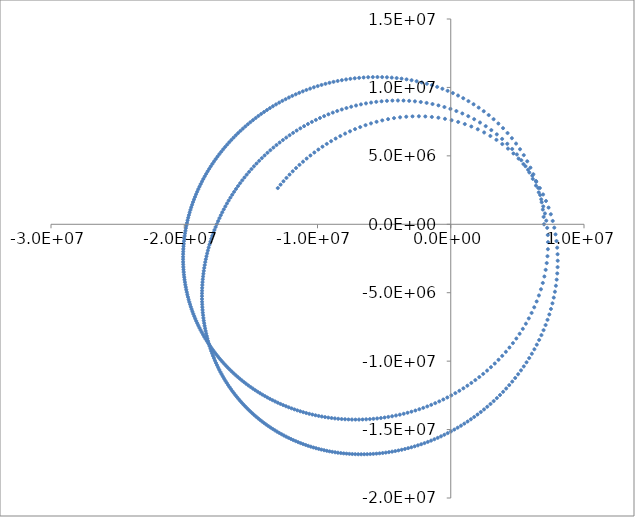
| Category | y |
|---|---|
| 7000000.0 | 0 |
| 6970744.563265306 | 540000 |
| 6912247.695336646 | 1077734.765 |
| 6824807.84654836 | 1610956.837 |
| 6709000.306904224 | 2137482.877 |
| 6565659.882708135 | 2655236.96 |
| 6395855.11030535 | 3162288.521 |
| 6200855.849663443 | 3656883.226 |
| 5982096.4569765115 | 4137465.668 |
| 5741136.837219459 | 4602693.514 |
| 5479623.544326599 | 5051443.393 |
| 5199252.78126137 | 5482809.333 |
| 4901736.72480994 | 5896094.911 |
| 4588774.131775136 | 6290800.493 |
| 4262025.734464467 | 6666606.966 |
| 3923094.546054238 | 7023357.27 |
| 3573510.8932948923 | 7361036.899 |
| 3214721.7810096205 | 7679754.301 |
| 2848084.0636164574 | 7979721.912 |
| 2474860.839920815 | 8261238.344 |
| 2096220.4821772815 | 8524672.048 |
| 1713237.7425587033 | 8770446.645 |
| 1326896.4353818125 | 8999027.985 |
| 938093.2602947245 | 9210912.906 |
| 547642.4017280855 | 9406619.618 |
| 156280.60757146648 | 9586679.579 |
| -235327.4881868231 | 9751630.726 |
| -626583.9799845004 | 9902011.914 |
| -1016952.3775834157 | 10038358.399 |
| -1405952.4626431507 | 10161198.243 |
| -1793155.3817200076 | 10271049.483 |
| -2178179.018357249 | 10368417.968 |
| -2560683.668356701 | 10453795.747 |
| -2940368.0283174207 | 10527659.907 |
| -3316965.497235217 | 10590471.797 |
| -3690240.783622947 | 10642676.559 |
| -4059986.805593554 | 10684702.901 |
| -4426021.868112298 | 10716963.078 |
| -4788187.099737138 | 10739853.027 |
| -5146344.130279017 | 10753752.624 |
| -5500372.990652505 | 10759026.034 |
| -5850170.216538583 | 10756022.14 |
| -6195647.138181509 | 10745075.008 |
| -6536728.339566849 | 10726504.405 |
| -6873350.2712853495 | 10700616.322 |
| -7205460.002509714 | 10667703.524 |
| -7533014.098649718 | 10628046.095 |
| -7855977.612371332 | 10581911.987 |
| -8174323.176744582 | 10529557.553 |
| -8488030.190307863 | 10471228.083 |
| -8797084.084794667 | 10407158.308 |
| -9101475.66715783 | 10337572.908 |
| -9401200.528345434 | 10262686.986 |
| -9696258.512032285 | 10182706.534 |
| -9986653.237194259 | 10097828.874 |
| -10272391.669032948 | 10008243.084 |
| -10553483.733319309 | 9914130.406 |
| -10829941.969731415 | 9815664.628 |
| -11101781.220217625 | 9713012.454 |
| -11369018.348826565 | 9606333.857 |
| -11631671.989813598 | 9495782.41 |
| -11889762.32116374 | 9381505.599 |
| -12143310.860967001 | 9263645.131 |
| -12392340.284347229 | 9142337.21 |
| -12636874.258882906 | 9017712.812 |
| -12876937.296670718 | 8889897.94 |
| -13112554.621372772 | 8759013.865 |
| -13343752.048758421 | 8625177.357 |
| -13570555.879403751 | 8488500.901 |
| -13792992.80234797 | 8349092.906 |
| -14011089.808627736 | 8207057.899 |
| -14224874.1137196 | 8062496.708 |
| -14434373.088018328 | 7915506.64 |
| -14639614.194566421 | 7766181.648 |
| -14840624.933328494 | 7614612.483 |
| -15037432.791374464 | 7460886.853 |
| -15230065.198398495 | 7305089.554 |
| -15418549.487057218 | 7147302.613 |
| -15602912.857661443 | 6987605.412 |
| -15783182.346801173 | 6826074.808 |
| -15959384.799524706 | 6662785.249 |
| -16131546.844729345 | 6497808.886 |
| -16299694.87345441 | 6331215.672 |
| -16463855.019796979 | 6163073.462 |
| -16624053.144197628 | 5993448.111 |
| -16780314.81886761 | 5822403.557 |
| -16932665.31515062 | 5650001.909 |
| -17081129.59263202 | 5476303.528 |
| -17225732.289826013 | 5301367.103 |
| -17366497.716287278 | 5125249.726 |
| -17503449.846008074 | 4948006.957 |
| -17636612.311974745 | 4769692.898 |
| -17766008.40176945 | 4590360.25 |
| -17891661.054113578 | 4410060.377 |
| -18013592.856258933 | 4228843.363 |
| -18131826.04214156 | 4046758.067 |
| -18246382.491220955 | 3863852.178 |
| -18357283.727934606 | 3680172.261 |
| -18464550.921704292 | 3495763.811 |
| -18568204.887436483 | 3310671.293 |
| -18668266.086464524 | 3124938.193 |
| -18764754.62788517 | 2938607.055 |
| -18857690.270246394 | 2751719.523 |
| -18947092.42354749 | 2564316.384 |
| -19032980.15151607 | 2376437.6 |
| -19115372.174129847 | 2188122.346 |
| -19194286.87035427 | 1999409.044 |
| -19269742.28106957 | 1810335.4 |
| -19341756.11216354 | 1620938.429 |
| -19410345.737768445 | 1431254.493 |
| -19475528.203622673 | 1241319.323 |
| -19537320.230539534 | 1051168.056 |
| -19595738.217967436 | 860835.256 |
| -19650798.24762715 | 670354.941 |
| -19702516.087213397 | 479760.613 |
| -19750907.19414924 | 289085.278 |
| -19795986.719383042 | 98361.473 |
| -19837769.51121877 | -92378.713 |
| -19876270.119171508 | -283103.614 |
| -19911502.797840904 | -473781.97 |
| -19943481.51079622 | -664382.899 |
| -19972219.93446726 | -854875.884 |
| -19997731.462036397 | -1045230.747 |
| -20020029.207327362 | -1235417.634 |
| -20039126.00868722 | -1425406.993 |
| -20055034.432858445 | -1615169.559 |
| -20067766.778838515 | -1804676.334 |
| -20077335.081725005 | -1993898.57 |
| -20083751.1165445 | -2182807.751 |
| -20087026.402064145 | -2371375.578 |
| -20087172.204585016 | -2559573.954 |
| -20084199.54171683 | -2747374.966 |
| -20078119.18613388 | -2934750.866 |
| -20068941.66931244 | -3121674.066 |
| -20056677.28525007 | -3308117.111 |
| -20041336.09416772 | -3494052.672 |
| -20022927.92619562 | -3679453.529 |
| -20001462.38504438 | -3864292.557 |
| -19976948.851662844 | -4048542.711 |
| -19949396.487884592 | -4232177.014 |
| -19918814.24006519 | -4415168.541 |
| -19885210.842712514 | -4597490.405 |
| -19848594.822112724 | -4779115.746 |
| -19808974.49995476 | -4960017.715 |
| -19766357.99695637 | -5140169.463 |
| -19720753.23649499 | -5319544.126 |
| -19672167.948247008 | -5498114.811 |
| -19620609.671839263 | -5675854.585 |
| -19566085.760516744 | -5852736.459 |
| -19508603.38483086 | -6028733.378 |
| -19448169.536352854 | -6203818.204 |
| -19384791.031417213 | -6377963.708 |
| -19318474.514900237 | -6551142.55 |
| -19249226.464039236 | -6723327.271 |
| -19177053.19229814 | -6894490.277 |
| -19101960.853285633 | -7064603.828 |
| -19023955.44473229 | -7233640.018 |
| -18943042.8125336 | -7401570.77 |
| -18859228.65486607 | -7568367.816 |
| -18772518.52638414 | -7734002.684 |
| -18682917.84250598 | -7898446.686 |
| -18590431.883796766 | -8061670.9 |
| -18495065.800458577 | -8223646.159 |
| -18396824.616936482 | -8384343.034 |
| -18295713.23665107 | -8543731.818 |
| -18191736.446868226 | -8701782.513 |
| -18084898.92371761 | -8858464.813 |
| -17975205.23737205 | -9013748.088 |
| -17862659.857400715 | -9167601.369 |
| -17747267.158309855 | -9319993.328 |
| -17629031.42528557 | -9470892.266 |
| -17507956.860154238 | -9620266.09 |
| -17384047.587576948 | -9768082.3 |
| -17257307.66149555 | -9914307.968 |
| -17127741.071848948 | -10058909.72 |
| -16995351.751579482 | -10201853.718 |
| -16860143.583950654 | -10343105.637 |
| -16722120.410198685 | -10482630.649 |
| -16581286.037542066 | -10620393.398 |
| -16437644.247574758 | -10756357.984 |
| -16291198.805070523 | -10890487.933 |
| -16141953.467227701 | -11022746.184 |
| -15989911.993385773 | -11153095.056 |
| -15835078.15524727 | -11281496.231 |
| -15677455.74764085 | -11407910.725 |
| -15517048.599864013 | -11532298.866 |
| -15353860.58764652 | -11654620.264 |
| -15187895.645778656 | -11774833.784 |
| -15019157.78145158 | -11892897.519 |
| -14847651.088360447 | -12008768.762 |
| -14673379.761624768 | -12122403.971 |
| -14496348.113584382 | -12233758.742 |
| -14316560.590533884 | -12342787.775 |
| -14134021.790462945 | -12449444.84 |
| -13948736.48187513 | -12553682.742 |
| -13760709.62376332 | -12655453.284 |
| -13569946.386825765 | -12754707.233 |
| -13376452.176013412 | -12851394.276 |
| -13180232.65450603 | -12945462.983 |
| -12981293.769222414 | -13036860.764 |
| -12779641.777978193 | -13125533.826 |
| -12575283.278413784 | -13211427.126 |
| -12368225.238824831 | -13294484.325 |
| -12158475.031038146 | -13374647.738 |
| -11946040.46548774 | -13451858.286 |
| -11730929.828658152 | -13526055.439 |
| -11513151.923076106 | -13597177.165 |
| -11292716.110046392 | -13665159.869 |
| -11069632.355344348 | -13729938.335 |
| -10843911.278095039 | -13791445.665 |
| -10615564.20308876 | -13849613.212 |
| -10384603.216803707 | -13904370.516 |
| -10151041.22742986 | -13955645.23 |
| -9914892.029213559 | -14003363.051 |
| -9676170.371469913 | -14047447.642 |
| -9434892.032640591 | -14087820.553 |
| -9191073.899807742 | -14124401.141 |
| -8944734.054111132 | -14157106.482 |
| -8695891.862555463 | -14185851.282 |
| -8444568.076738402 | -14210547.789 |
| -8190784.939077729 | -14231105.69 |
| -7934566.297168387 | -14247432.016 |
| -7675937.726957727 | -14259431.037 |
| -7414926.665490265 | -14267004.153 |
| -7151562.554042402 | -14270049.784 |
| -6885876.992543433 | -14268463.251 |
| -6617903.906262355 | -14262136.659 |
| -6347679.725831252 | -14250958.771 |
| -6075243.581776142 | -14234814.879 |
| -5800637.51483591 | -14213586.672 |
| -5523906.703470236 | -14187152.1 |
| -5245099.710089214 | -14155385.231 |
| -4964268.747681592 | -14118156.108 |
| -4681469.968676332 | -14075330.605 |
| -4396763.778044611 | -14026770.268 |
| -4110215.1728374 | -13972332.17 |
| -3821894.1105587077 | -13911868.753 |
| -3531875.9089972433 | -13845227.672 |
| -3240241.6803807984 | -13772251.639 |
| -2947078.8029787666 | -13692778.271 |
| -2652481.4335595113 | -13606639.937 |
| -2356551.0644109463 | -13513663.611 |
| -2059397.1289544194 | -13413670.732 |
| -1761137.6603227821 | -13306477.077 |
| -1461900.0076314248 | -13191892.641 |
| -1161821.6150428285 | -13069721.536 |
| -861050.8691059137 | -12939761.916 |
| -559748.0202339974 | -12801805.922 |
| -258086.18455946702 | -12655639.662 |
| 43747.5672444083 | -12501043.24 |
| 345551.02727236337 | -12337790.821 |
| 647105.5666780265 | -12165650.77 |
| 948174.7436492369 | -11984385.855 |
| 1248502.7957611384 | -11793753.546 |
| 1547813.0095854984 | -11593506.414 |
| 1845805.9608835033 | -11383392.656 |
| 2142157.619509968 | -11163156.773 |
| 2436517.314420419 | -10932540.42 |
| 2728505.5560372816 | -10691283.465 |
| 3017711.7158685504 | -10439125.296 |
| 3303691.5668911207 | -10175806.405 |
| 3585964.6930645728 | -9901070.312 |
| 3864011.7827311317 | -9614665.87 |
| 4137271.828937182 | -9316350.02 |
| 4405139.270285731 | -9005891.048 |
| 4666961.119247944 | -8683072.434 |
| 4922034.141406237 | -8347697.351 |
| 5169602.169354588 | -7999593.909 |
| 5408853.659380868 | -7638621.212 |
| 5638919.627917382 | -7264676.317 |
| 5858872.138153672 | -6877702.153 |
| 6067723.5448571155 | -6477696.456 |
| 6264426.746444407 | -6064721.747 |
| 6447876.735937304 | -5638916.327 |
| 6616913.78370213 | -5200506.236 |
| 6770328.620407274 | -4749818.002 |
| 6906870.012245613 | -4287291.969 |
| 7025255.1240203995 | -3813495.813 |
| 7124183.039195739 | -3329137.772 |
| 7202351.738177818 | -2835078.929 |
| 7258478.715529188 | -2332343.75 |
| 7291325.234053636 | -1822127.936 |
| 7299723.964063906 | -1305802.533 |
| 7282609.443376113 | -784913.222 |
| 7239050.433411914 | -261173.747 |
| 7168282.869722775 | 263547.37 |
| 7069741.756880705 | 787247.371 |
| 6943090.095306407 | 1307817.137 |
| 6788242.812161468 | 1823075.908 |
| 6605383.7521621445 | 2330811.731 |
| 6394974.09627546 | 2828825.901 |
| 6157751.1103899805 | 3314979.156 |
| 5894716.834321929 | 3787237.097 |
| 5607117.118497774 | 4243712.236 |
| 5296412.193052741 | 4682700.339 |
| 4964240.602858864 | 5102709.186 |
| 4612378.775697256 | 5502478.573 |
| 4242698.663114841 | 5880991.091 |
| 3857125.805078046 | 6237473.975 |
| 3457599.8627980184 | 6571392.908 |
| 3046039.209194893 | 6882439.091 |
| 2624310.6433345326 | 7170511.165 |
| 2194204.777243405 | 7435693.599 |
| 1757417.1866387066 | 7678233.09 |
| 1315535.0549538902 | 7898514.306 |
| 870028.7850108265 | 8097036.08 |
| 422247.9005108932 | 8274388.858 |
| -26579.50483839208 | 8431233.967 |
| -475344.5093918828 | 8568285.038 |
| -923052.9853919253 | 8686291.737 |
| -1368819.710539328 | 8786025.797 |
| -1811861.4874228316 | 8868269.266 |
| -2251489.694752815 | 8933804.805 |
| -2687102.605221528 | 8983407.836 |
| -3118177.7250295593 | 9017840.316 |
| -3544264.341681479 | 9037845.934 |
| -3964976.409973955 | 9044146.495 |
| -4379985.860577789 | 9037439.335 |
| -4789016.3800865775 | 9018395.554 |
| -5191837.68445544 | 8987658.941 |
| -5588260.287929195 | 8945845.453 |
| -5978130.755490804 | 8893543.12 |
| -6361327.417329201 | 8831312.303 |
| -6737756.517789138 | 8759686.206 |
| -7107348.767861429 | 8679171.592 |
| -7470056.268802457 | 8590249.635 |
| -7825849.77438552 | 8493376.874 |
| -8174716.260155491 | 8388986.236 |
| -8516656.769556403 | 8277488.082 |
| -8851684.508685121 | 8159271.285 |
| -9179823.163514296 | 8034704.295 |
| -9501105.41559625 | 7904136.19 |
| -9815571.634416597 | 7767897.708 |
| -10123268.726652125 | 7626302.24 |
| -10424249.124563266 | 7479646.791 |
| -10718569.897594659 | 7328212.903 |
| -11006291.972956957 | 7172267.531 |
| -11287479.452515787 | 7012063.879 |
| -11562199.014722282 | 6847842.195 |
| -11830519.391589725 | 6679830.522 |
| -12092510.911860753 | 6508245.405 |
| -12348245.10252889 | 6333292.565 |
| -12597794.341786616 | 6155167.525 |
| -12841231.557279903 | 5974056.205 |
| -13078629.964265823 | 5790135.484 |
| -13310062.83890459 | 5603573.718 |
| -13535603.322478948 | 5414531.239 |
| -13755324.252830075 | 5223160.814 |
| -13969298.019737206 | 5029608.081 |
| -14177596.441354888 | 4834011.955 |
| -14380290.659162652 | 4636505.012 |
| -14577451.049182596 | 4437213.848 |
| -14769147.147485327 | 4236259.415 |
| -14955447.588238332 | 4033757.336 |
| -15136420.05275672 | 3829818.204 |
| -15312131.228197744 | 3624547.861 |
| -15482646.774700541 | 3418047.655 |
| -15648031.299913507 | 3210414.693 |
| -15808348.339976206 | 3001742.065 |
| -15963660.346132366 | 2792119.064 |
| -16114028.676247371 | 2581631.391 |
| -16259513.590589091 | 2370361.345 |
| -16400174.251306295 | 2158388.005 |
| -16536068.72510556 | 1945787.398 |
| -16667253.988686346 | 1732632.662 |
| -16793785.936546 | 1518994.194 |
| -16915719.390812308 | 1304939.792 |
| -17033108.112801883 | 1090534.794 |
| -17146004.81603867 | 875842.197 |
| -17254461.18049848 | 660922.781 |
| -17358527.867873773 | 445835.221 |
| -17458254.537677635 | 230636.193 |
| -17553689.864028044 | 15380.472 |
| -17644881.552972957 | -199878.967 |
| -17731876.360234044 | -415090.864 |
| -17814720.109262187 | -630205.588 |
| -17893457.709511407 | -845175.054 |
| -17968133.174849868 | -1059952.65 |
| -18038789.64203724 | -1274493.163 |
| -18105469.389207084 | -1488752.71 |
| -18168213.854301322 | -1702688.671 |
| -18227063.653411098 | -1916259.631 |
| -18282058.598985016 | -2129425.321 |
| -18333237.717871387 | -2342146.557 |
| -18380639.26916629 | -2554385.194 |
| -18424300.761843767 | -2766104.069 |
| -18464258.972148415 | -2977266.958 |
| -18500549.960734222 | -3187838.526 |
| -18533209.089536555 | -3397784.286 |
| -18562271.038366973 | -3607070.558 |
| -18587769.82122293 | -3815664.425 |
| -18609738.8023066 | -4023533.702 |
| -18628210.711748876 | -4230646.891 |
| -18643217.66103626 | -4436973.154 |
| -18654791.158139803 | -4642482.276 |
| -18662962.12234647 | -4847144.634 |
| -18667760.898794476 | -5050931.168 |
| -18669217.272715036 | -5253813.349 |
| -18667360.483383775 | -5455763.154 |
| -18662219.237785902 | -5656753.036 |
| -18653821.723999705 | -5856755.902 |
| -18642195.624303576 | -6055745.086 |
| -18627368.128012195 | -6253694.327 |
| -18609365.944047913 | -6450577.742 |
| -18588215.313253682 | -6646369.808 |
| -18563942.0204542 | -6841045.341 |
| -18536571.406272165 | -7034579.472 |
| -18506128.37870669 | -7226947.63 |
| -18472637.424481213 | -7418125.523 |
| -18436122.620168235 | -7608089.117 |
| -18396607.643098425 | -7796814.621 |
| -18354115.782061685 | -7984278.468 |
| -18308669.947807867 | -8170457.298 |
| -18260292.683354862 | -8355327.943 |
| -18209006.174111858 | -8538867.411 |
| -18154832.257825576 | -8721052.868 |
| -18097792.434357353 | -8901861.626 |
| -18037907.875298936 | -9081271.129 |
| -17975199.4334349 | -9259258.934 |
| -17909687.652059592 | -9435802.703 |
| -17841392.77415656 | -9610880.185 |
| -17770334.751448415 | -9784469.203 |
| -17696533.253325127 | -9956547.645 |
| -17620007.675658736 | -10127093.446 |
| -17540777.149512578 | -10296084.579 |
| -17458860.54975304 | -10463499.04 |
| -17374276.503572036 | -10629314.839 |
| -17287043.398928344 | -10793509.985 |
| -17197179.392916076 | -10956062.476 |
| -17104702.420068588 | -11116950.284 |
| -17009630.200606223 | -11276151.35 |
| -16911980.248636406 | -11433643.567 |
| -16811769.880314667 | -11589404.769 |
| -16709016.221975341 | -11743412.722 |
| -16603736.218240803 | -11895645.111 |
| -16495946.64011823 | -12046079.531 |
| -16385664.093093101 | -12194693.474 |
| -16272905.025228782 | -12341464.317 |
| -16157685.73528177 | -12486369.313 |
| -16040022.380842391 | -12629385.58 |
| -15919930.986511003 | -12770490.089 |
| -15797427.452119982 | -12909659.651 |
| -15672527.561012117 | -13046870.911 |
| -15545246.988386307 | -13182100.33 |
| -15415601.309721818 | -13315324.18 |
| -15283606.00929273 | -13446518.53 |
| -15149276.488784572 | -13575659.232 |
| -15012628.076025642 | -13702721.915 |
| -14873676.033845875 | -13827681.968 |
| -14732435.569076713 | -13950514.533 |
| -14588921.841705924 | -14071194.488 |
| -14443149.97420189 | -14189696.439 |
| -14295135.061022526 | -14305994.706 |
| -14144892.17832465 | -14420063.311 |
| -13992436.393890323 | -14531875.965 |
| -13837782.777287481 | -14641406.056 |
| -13680946.410282945 | -14748626.634 |
| -13521942.397526853 | -14853510.4 |
| -13360785.877528412 | -14956029.691 |
| -13197492.033943972 | -15056156.468 |
| -13032076.10719941 | -15153862.299 |
| -12864553.406470068 | -15249118.346 |
| -12694939.322042648 | -15341895.353 |
| -12523249.338084856 | -15432163.625 |
| -12349499.045849985 | -15519893.017 |
| -12173704.157345153 | -15605052.92 |
| -11995880.519493574 | -15687612.239 |
| -11816044.128822945 | -15767539.38 |
| -11634211.146713968 | -15844802.234 |
| -11450397.915245008 | -15919368.158 |
| -11264620.973671041 | -15991203.956 |
| -11076897.075577393 | -16060275.863 |
| -10887243.206751226 | -16126549.527 |
| -10695676.603816416 | -16189989.984 |
| -10502214.77368032 | -16250561.646 |
| -10306875.513844 | -16308228.274 |
| -10109676.93363079 | -16362952.962 |
| -9910637.476391612 | -16414698.109 |
| -9709775.942749286 | -16463425.405 |
| -9507111.514948176 | -16509095.801 |
| -9302663.782379879 | -16551669.488 |
| -9096452.76836048 | -16591105.876 |
| -8888498.958239947 | -16627363.561 |
| -8678823.328929733 | -16660400.307 |
| -8467447.379940646 | -16690173.015 |
| -8254393.166029311 | -16716637.698 |
| -8039683.331558547 | -16739749.449 |
| -7823341.146684312 | -16759462.419 |
| -7605390.545489923 | -16775729.776 |
| -7385856.166196868 | -16788503.687 |
| -7164763.393590877 | -16797735.274 |
| -6942138.403811967 | -16803374.588 |
| -6718008.211668093 | -16805370.576 |
| -6492400.720643766 | -16803671.041 |
| -6265344.775787774 | -16798222.609 |
| -6036870.21967785 | -16788970.691 |
| -5807007.951675091 | -16775859.447 |
| -5575789.990697007 | -16758831.742 |
| -5343249.541755571 | -16737829.112 |
| -5109421.066525571 | -16712791.715 |
| -4874340.358229033 | -16683658.294 |
| -4638044.621143742 | -16650366.131 |
| -4400572.555067967 | -16612851.001 |
| -4161964.4450996066 | -16571047.128 |
| -3922262.2571163587 | -16524887.134 |
| -3681509.7393742055 | -16474301.994 |
| -3439752.5306749074 | -16419220.987 |
| -3197038.2755893692 | -16359571.64 |
| -2953416.7472630218 | -16295279.684 |
| -2708939.978371977 | -16226268.995 |
| -2463662.4008449377 | -16152461.545 |
| -2217640.9950160035 | -16073777.348 |
| -1970935.448927879 | -15990134.406 |
| -1723608.3285639544 | -15901448.651 |
| -1475725.2598515875 | -15807633.899 |
| -1227355.1233480778 | -15708601.787 |
| -978570.2625956428 | -15604261.726 |
| -729446.7072125807 | -15494520.848 |
| -480064.41187510896 | -15379283.952 |
| -230507.51243849163 | -15258453.461 |
| 19135.399452647893 | -15131929.372 |
| 268770.98180616094 | -14999609.217 |
| 518300.8262011751 | -14861388.023 |
| 767621.1184842591 | -14717158.281 |
| 1016622.2744109596 | -14566809.922 |
| 1265188.5482604892 | -14410230.295 |
| 1513197.6123036193 | -14247304.167 |
| 1760520.1048492538 | -14077913.719 |
| 2007019.144434781 | -13901938.569 |
| 2252549.8075606665 | -13719255.806 |
| 2496958.567203088 | -13529740.038 |
| 2740082.6891727927 | -13333263.477 |
| 2981749.5832279227 | -13129696.034 |
| 3221776.105698861 | -12918905.455 |
| 3459967.810251412 | -12700757.494 |
| 3696118.143310361 | -12475116.121 |
| 3930007.5806007925 | -12241843.786 |
| 4161402.7012550794 | -12000801.737 |
| 4390055.195999063 | -11751850.405 |
| 4615700.80609664 | -11494849.867 |
| 4838058.19002934 | -11229660.396 |
| 5056827.715355855 | -10956143.114 |
| 5271690.1738851005 | -10674160.766 |
| 5482305.419265641 | -10383578.626 |
| 5688310.927419147 | -10084265.567 |
| 5889320.282016901 | -9776095.302 |
| 6084921.589526948 | -9458947.84 |
| 6274675.83137834 | -9132711.176 |
| 6458115.164656344 | -8797283.241 |
| 6634741.187644867 | -8452574.175 |
| 6804023.192685527 | -8098508.925 |
| 6965396.436472124 | -7735030.249 |
| 7118260.467316581 | -7362102.143 |
| 7261977.560398349 | -6979713.765 |
| 7395871.325839038 | -6587883.878 |
| 7519225.570902318 | -6186665.898 |
| 7631283.516922228 | -5776153.552 |
| 7731247.493810756 | -5356487.225 |
| 7818279.260089711 | -4927860.997 |
| 7891501.123924265 | -4490530.387 |
| 7949998.069741144 | -4044820.803 |
| 7992821.124189236 | -3591136.615 |
| 8018992.222088063 | -3129970.782 |
| 8027510.854174638 | -2661914.843 |
| 8017362.789181257 | -2187669.046 |
| 7987531.156925497 | -1708052.264 |
| 7937010.149177555 | -1224011.27 |
| 7864821.532582136 | -736628.792 |
| 7770034.064123245 | -247129.677 |
| 7651785.746963243 | 243115.622 |
| 7509308.658617861 | 732591.114 |
| 7341955.825902749 | 1219639.785 |
| 7149229.322347629 | 1702473.402 |
| 6930808.445796858 | 2179188.319 |
| 6686576.53150674 | 2647787.717 |
| 6416644.7155739 | 3106210.326 |
| 6121370.83797522 | 3552365.187 |
| 5801371.714508311 | 3984171.448 |
| 5457527.248681119 | 4399601.594 |
| 5090975.3071741555 | 4796726.041 |
| 4703096.918476192 | 5173756.672 |
| 4295492.107845275 | 5529086.771 |
| 3869947.4566841177 | 5861325.002 |
| 3428397.161729727 | 6169321.487 |
| 2972879.870194311 | 6452184.685 |
| 2505493.813923122 | 6709288.53 |
| 2028352.7370206388 | 6940270.081 |
| 1543544.832968592 | 7145018.595 |
| 1053096.44253516 | 7323657.481 |
| 558941.6967234705 | 7476520.878 |
| 62898.70489395759 | 7604126.701 |
| -433347.6420732109 | 7707147.944 |
| -928256.6126203793 | 7786383.762 |
| -1420436.983821671 | 7842731.598 |
| -1908647.6452981315 | 7877161.271 |
| -2391794.376988565 | 7890691.648 |
| -2868923.7080953815 | 7884370.213 |
| -3339214.693381318 | 7859255.651 |
| -3801969.336530316 | 7816403.373 |
| -4256602.268103044 | 7756853.808 |
| -4702630.162195176 | 7681623.187 |
| -5139661.260824355 | 7591696.536 |
| -5567385.273794631 | 7488022.565 |
| -5985563.836657636 | 7371510.154 |
| -6394021.64059358 | 7243026.159 |
| -6792638.294418827 | 7103394.297 |
| -7181340.9386243075 | 6953394.87 |
| -7560097.602222265 | 6793765.162 |
| -7928911.273103077 | 6625200.336 |
| -8287814.639631932 | 6448354.708 |
| -8636865.4536574 | 6263843.277 |
| -8976142.461552553 | 6072243.442 |
| -9305741.849228064 | 5874096.823 |
| -9625774.148353767 | 5669911.137 |
| -9936361.553617325 | 5460162.084 |
| -10237635.604224814 | 5245295.219 |
| -10529735.186635438 | 5025727.777 |
| -10812804.819456212 | 4801850.439 |
| -11086993.1853204 | 4574029.026 |
| -11352451.878315937 | 4342606.116 |
| -11609334.339043172 | 4107902.575 |
| -11857794.952624233 | 3870219.007 |
| -12097988.287941786 | 3629837.115 |
| -12330068.459051492 | 3387020.978 |
| -12554188.592099179 | 3142018.25 |
| -12770500.383196343 | 2895061.277 |
| -12979153.734585518 | 2646368.143 |